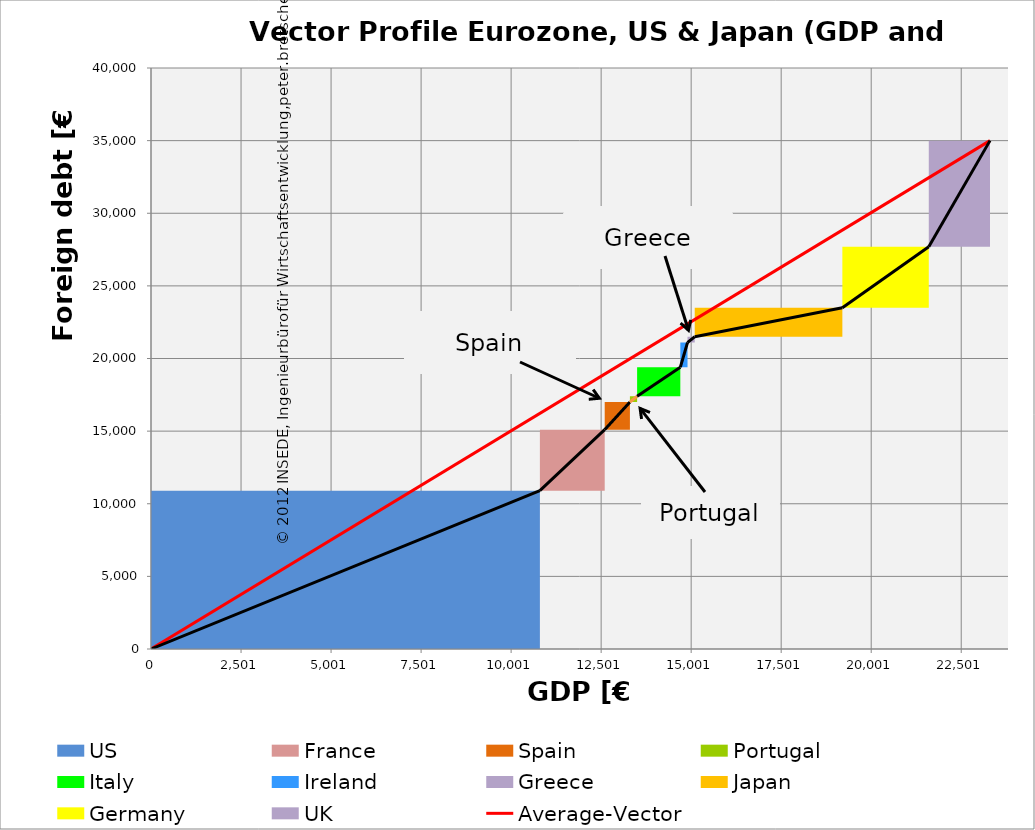
| Category | transparent | US | France | Spain | Portugal | Italy | Ireland | Greece | Japan | Germany | UK | Border right & top |
|---|---|---|---|---|---|---|---|---|---|---|---|---|
| 0.0 | 0 | 10900 | 0 | 0 | 0 | 0 | 0 | 0 | 0 | 0 | 0 | 0 |
| 10800.0 | 0 | 10900 | 0 | 0 | 0 | 0 | 0 | 0 | 0 | 0 | 0 | 0 |
| 10800.0 | 10900 | 0 | 4200 | 0 | 0 | 0 | 0 | 0 | 0 | 0 | 0 | 0 |
| 12600.0 | 10900 | 0 | 4200 | 0 | 0 | 0 | 0 | 0 | 0 | 0 | 0 | 0 |
| 12600.0 | 15100 | 0 | 0 | 1900 | 0 | 0 | 0 | 0 | 0 | 0 | 0 | 0 |
| 13300.0 | 15100 | 0 | 0 | 1900 | 0 | 0 | 0 | 0 | 0 | 0 | 0 | 0 |
| 13300.0 | 17000 | 0 | 0 | 0 | 400 | 0 | 0 | 0 | 0 | 0 | 0 | 0 |
| 13500.0 | 17000 | 0 | 0 | 0 | 400 | 0 | 0 | 0 | 0 | 0 | 0 | 0 |
| 13500.0 | 17400 | 0 | 0 | 0 | 0 | 2000 | 0 | 0 | 0 | 0 | 0 | 0 |
| 14700.0 | 17400 | 0 | 0 | 0 | 0 | 2000 | 0 | 0 | 0 | 0 | 0 | 0 |
| 14700.0 | 19400 | 0 | 0 | 0 | 0 | 0 | 1700 | 0 | 0 | 0 | 0 | 0 |
| 14900.0 | 19400 | 0 | 0 | 0 | 0 | 0 | 1700 | 0 | 0 | 0 | 0 | 0 |
| 14900.0 | 21100 | 0 | 0 | 0 | 0 | 0 | 0 | 400 | 0 | 0 | 0 | 0 |
| 15100.0 | 21100 | 0 | 0 | 0 | 0 | 0 | 0 | 400 | 0 | 0 | 0 | 0 |
| 15100.0 | 21500 | 0 | 0 | 0 | 0 | 0 | 0 | 0 | 2000 | 0 | 0 | 0 |
| 19200.0 | 21500 | 0 | 0 | 0 | 0 | 0 | 0 | 0 | 2000 | 0 | 0 | 0 |
| 19200.0 | 23500 | 0 | 0 | 0 | 0 | 0 | 0 | 0 | 0 | 4200 | 0 | 0 |
| 21600.0 | 23500 | 0 | 0 | 0 | 0 | 0 | 0 | 0 | 0 | 4200 | 0 | 0 |
| 21600.0 | 27700 | 0 | 0 | 0 | 0 | 0 | 0 | 0 | 0 | 0 | 7300 | 0 |
| 23300.0 | 27700 | 0 | 0 | 0 | 0 | 0 | 0 | 0 | 0 | 0 | 7300 | 0 |
| 23300.0 | 35000 | 0 | 0 | 0 | 0 | 0 | 0 | 0 | 0 | 0 | 0 | 0 |
| 23800.0 | 35000 | 0 | 0 | 0 | 0 | 0 | 0 | 0 | 0 | 0 | 0 | 0 |
| 23800.0 | 35000 | 0 | 0 | 0 | 0 | 0 | 0 | 0 | 0 | 0 | 0 | 0 |